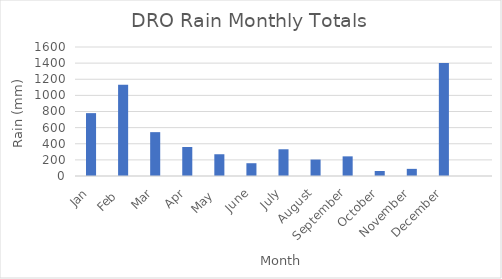
| Category | Totals |
|---|---|
| Jan | 779.7 |
| Feb  | 1132.7 |
| Mar | 543.9 |
| Apr | 360 |
| May  | 269.8 |
| June | 158.5 |
| July | 331.5 |
| August | 203.8 |
| September | 243.6 |
| October | 61.9 |
| November | 88.6 |
| December | 1400.5 |